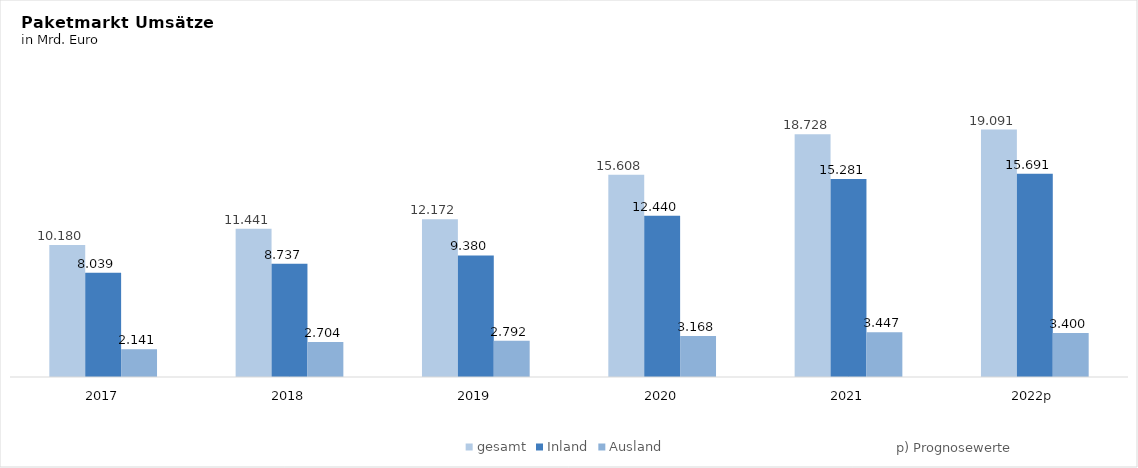
| Category | gesamt | Inland | Ausland  |
|---|---|---|---|
| 2017 | 10.18 | 8.039 | 2.141 |
| 2018 | 11.441 | 8.737 | 2.704 |
| 2019 | 12.172 | 9.38 | 2.792 |
| 2020 | 15.608 | 12.44 | 3.168 |
| 2021 | 18.728 | 15.281 | 3.447 |
| 2022p | 19.091 | 15.691 | 3.4 |